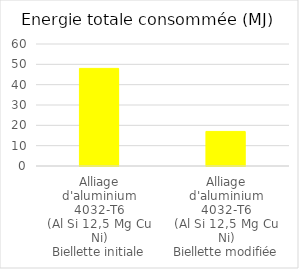
| Category | Series 0 |
|---|---|
| Alliage
d'aluminium
4032-T6
(Al Si 12,5 Mg Cu Ni)
Biellette initiale | 48 |
| Alliage
d'aluminium
4032-T6
(Al Si 12,5 Mg Cu Ni)
Biellette modifiée | 17 |